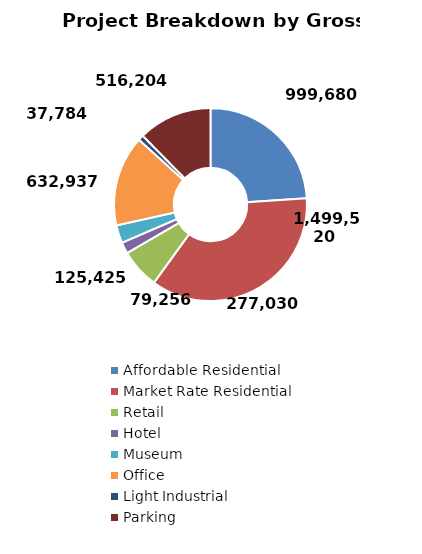
| Category | Series 0 |
|---|---|
| Affordable Residential | 999680 |
| Market Rate Residential | 1499520 |
| Retail | 277030 |
| Hotel | 79256 |
| Museum | 125425 |
| Office | 632937 |
| Light Industrial | 37784 |
| Parking | 516204 |